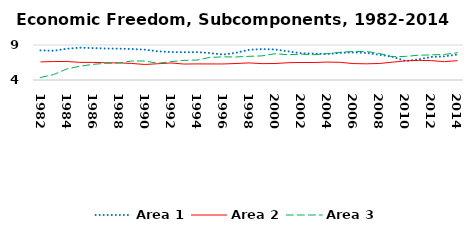
| Category | Area 1 | Area 2 | Area 3 |
|---|---|---|---|
| 1982.0 | 8.231 | 6.586 | 4.357 |
| 1983.0 | 8.173 | 6.636 | 4.774 |
| 1984.0 | 8.458 | 6.651 | 5.566 |
| 1985.0 | 8.615 | 6.522 | 5.959 |
| 1986.0 | 8.561 | 6.513 | 6.228 |
| 1987.0 | 8.496 | 6.462 | 6.388 |
| 1988.0 | 8.479 | 6.445 | 6.426 |
| 1989.0 | 8.425 | 6.362 | 6.713 |
| 1990.0 | 8.338 | 6.216 | 6.715 |
| 1991.0 | 8.101 | 6.324 | 6.389 |
| 1992.0 | 7.994 | 6.431 | 6.621 |
| 1993.0 | 7.957 | 6.28 | 6.8 |
| 1994.0 | 7.983 | 6.299 | 6.844 |
| 1995.0 | 7.851 | 6.294 | 7.227 |
| 1996.0 | 7.632 | 6.291 | 7.304 |
| 1997.0 | 7.889 | 6.356 | 7.289 |
| 1998.0 | 8.309 | 6.444 | 7.381 |
| 1999.0 | 8.419 | 6.338 | 7.448 |
| 2000.0 | 8.366 | 6.354 | 7.748 |
| 2001.0 | 8.095 | 6.47 | 7.618 |
| 2002.0 | 7.824 | 6.504 | 7.69 |
| 2003.0 | 7.767 | 6.503 | 7.613 |
| 2004.0 | 7.71 | 6.562 | 7.758 |
| 2005.0 | 7.871 | 6.524 | 7.969 |
| 2006.0 | 7.944 | 6.344 | 8.073 |
| 2007.0 | 7.875 | 6.314 | 8.08 |
| 2008.0 | 7.608 | 6.359 | 7.797 |
| 2009.0 | 7.334 | 6.546 | 7.326 |
| 2010.0 | 6.722 | 6.728 | 7.374 |
| 2011.0 | 6.94 | 6.805 | 7.536 |
| 2012.0 | 7.296 | 6.765 | 7.591 |
| 2013.0 | 7.37 | 6.619 | 7.652 |
| 2014.0 | 7.642 | 6.762 | 7.89 |